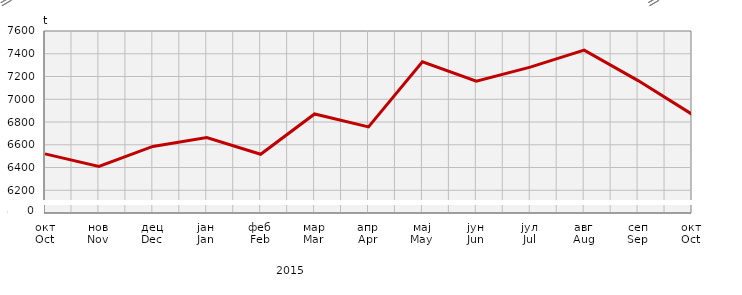
| Category | Прикупљање крављег млијека
Collecting of cow’s milk |
|---|---|
| окт
Oct | 6519.778 |
| нов
Nov | 6409.6 |
| дец
Dec | 6585.351 |
| јан
Jan | 6663.893 |
| феб
Feb | 6516.44 |
| мар
Mar | 6870.8 |
| апр
Apr | 6757.289 |
| мај
May | 7329.328 |
| јун
Jun | 7158.306 |
| јул
Jul | 7282.65 |
| авг
Aug | 7431.863 |
| сеп
Sep | 7163.964 |
| окт
Oct | 6867.986 |